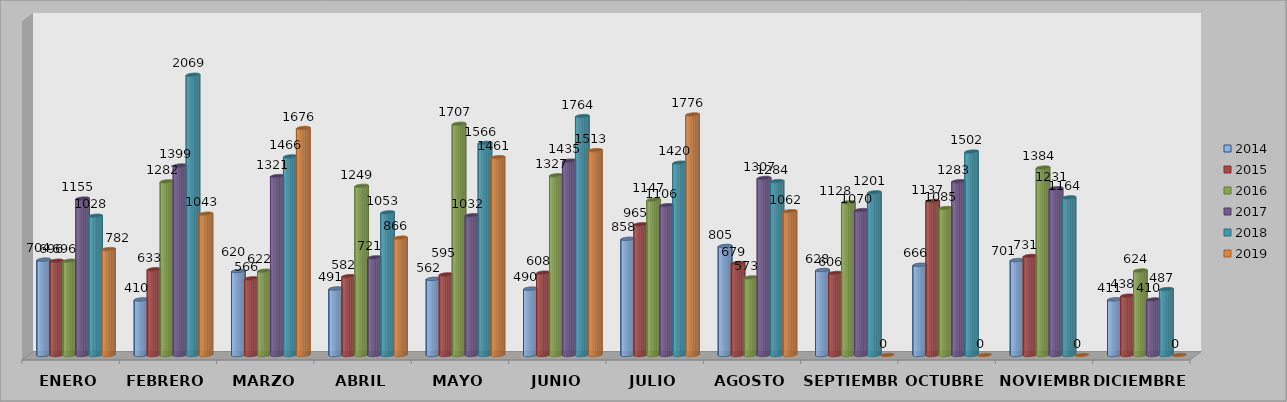
| Category | 2014 | 2015 | 2016 | 2017 | 2018 | 2019 |
|---|---|---|---|---|---|---|
| ENERO | 704 | 696 | 696 | 1155 | 1028 | 782 |
| FEBRERO | 410 | 633 | 1282 | 1399 | 2069 | 1043 |
| MARZO | 620 | 566 | 622 | 1321 | 1466 | 1676 |
| ABRIL | 491 | 582 | 1249 | 721 | 1053 | 866 |
| MAYO | 562 | 595 | 1707 | 1032 | 1566 | 1461 |
| JUNIO | 490 | 608 | 1327 | 1435 | 1764 | 1513 |
| JULIO | 858 | 965 | 1147 | 1106 | 1420 | 1776 |
| AGOSTO | 805 | 679 | 573 | 1307 | 1284 | 1062 |
| SEPTIEMBRE | 628 | 606 | 1128 | 1070 | 1201 | 0 |
| OCTUBRE | 666 | 1137 | 1085 | 1283 | 1502 | 0 |
| NOVIEMBRE | 701 | 731 | 1384 | 1231 | 1164 | 0 |
| DICIEMBRE | 411 | 438 | 624 | 410 | 487 | 0 |